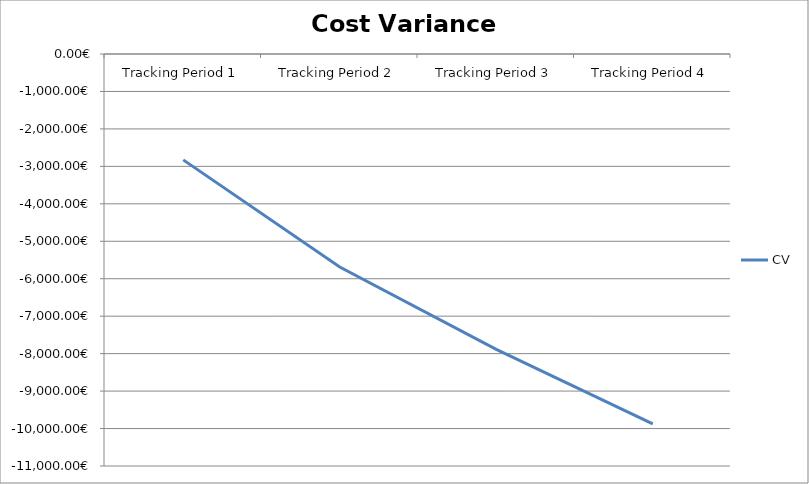
| Category | CV |
|---|---|
| Tracking Period 1 | -2827 |
| Tracking Period 2 | -5686 |
| Tracking Period 3 | -7885 |
| Tracking Period 4 | -9877 |